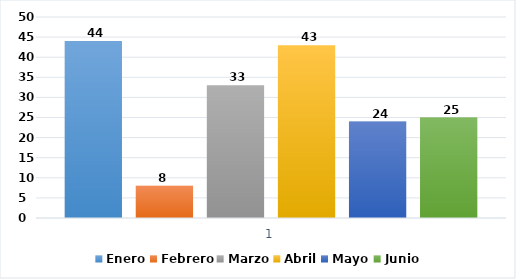
| Category | Enero | Febrero | Marzo | Abril | Mayo | Junio |
|---|---|---|---|---|---|---|
| 0 | 44 | 8 | 33 | 43 | 24 | 25 |